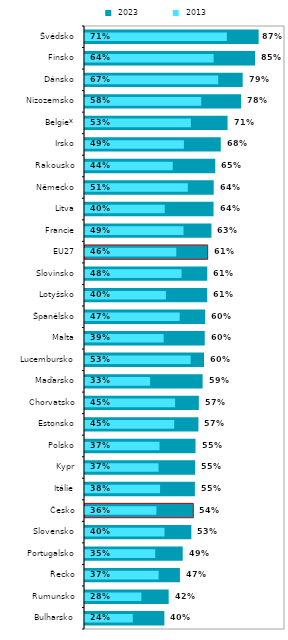
| Category |  2023 |
|---|---|
| Bulharsko | 0.397 |
| Rumunsko | 0.418 |
| Řecko | 0.475 |
| Portugalsko | 0.489 |
| Slovensko | 0.532 |
| Česko | 0.541 |
| Itálie | 0.55 |
| Kypr | 0.551 |
| Polsko | 0.553 |
| Estonsko | 0.567 |
| Chorvatsko | 0.569 |
| Maďarsko | 0.588 |
| Lucembursko | 0.595 |
| Malta | 0.599 |
| Španělsko | 0.601 |
| Lotyšsko | 0.611 |
| Slovinsko | 0.611 |
| EU27 | 0.613 |
| Francie | 0.632 |
| Litva | 0.643 |
| Německo | 0.644 |
| Rakousko | 0.651 |
| Irsko | 0.679 |
| Belgie* | 0.713 |
| Nizozemsko | 0.78 |
| Dánsko | 0.789 |
| Finsko | 0.85 |
| Švédsko | 0.868 |